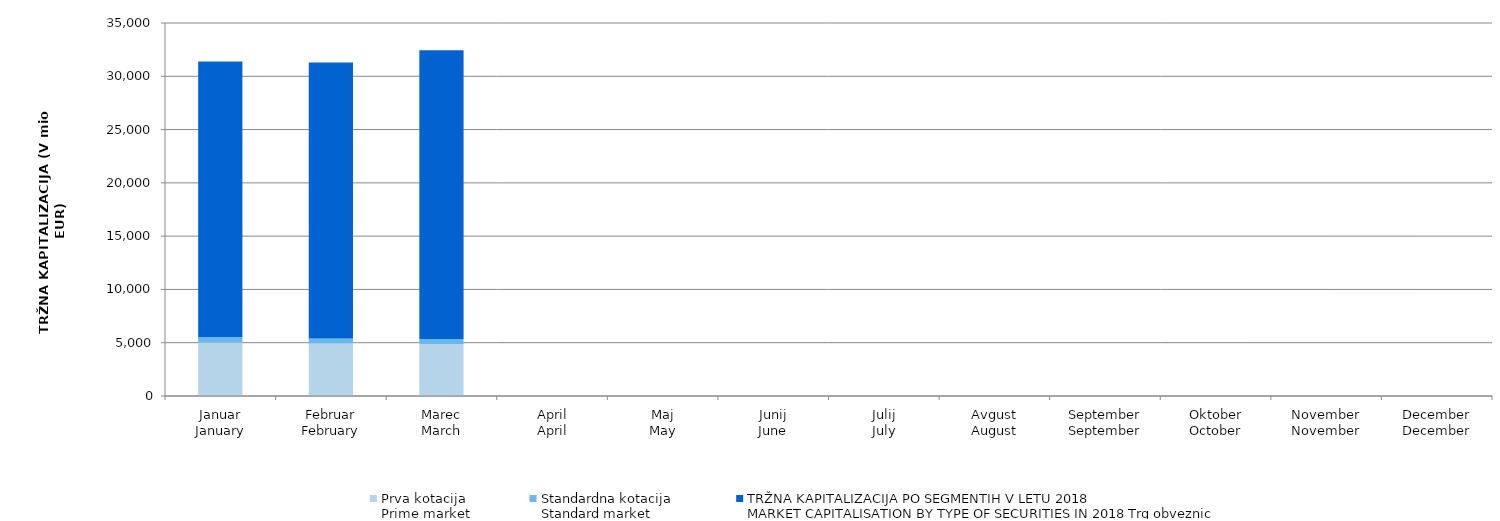
| Category | Prva kotacija
Prime market | Standardna kotacija
Standard market | Series 3 |
|---|---|---|---|
| Januar
January | 5022.792 | 483.67 | 25885.901 |
| Februar
February | 4922.405 | 471.165 | 25899.375 |
| Marec
March | 4884.025 | 463.212 | 27099.633 |
| April
April | 0 | 0 | 0 |
| Maj
May | 0 | 0 | 0 |
| Junij
June | 0 | 0 | 0 |
| Julij
July | 0 | 0 | 0 |
| Avgust
August | 0 | 0 | 0 |
| September
September | 0 | 0 | 0 |
| Oktober
October | 0 | 0 | 0 |
| November
November | 0 | 0 | 0 |
| December
December | 0 | 0 | 0 |